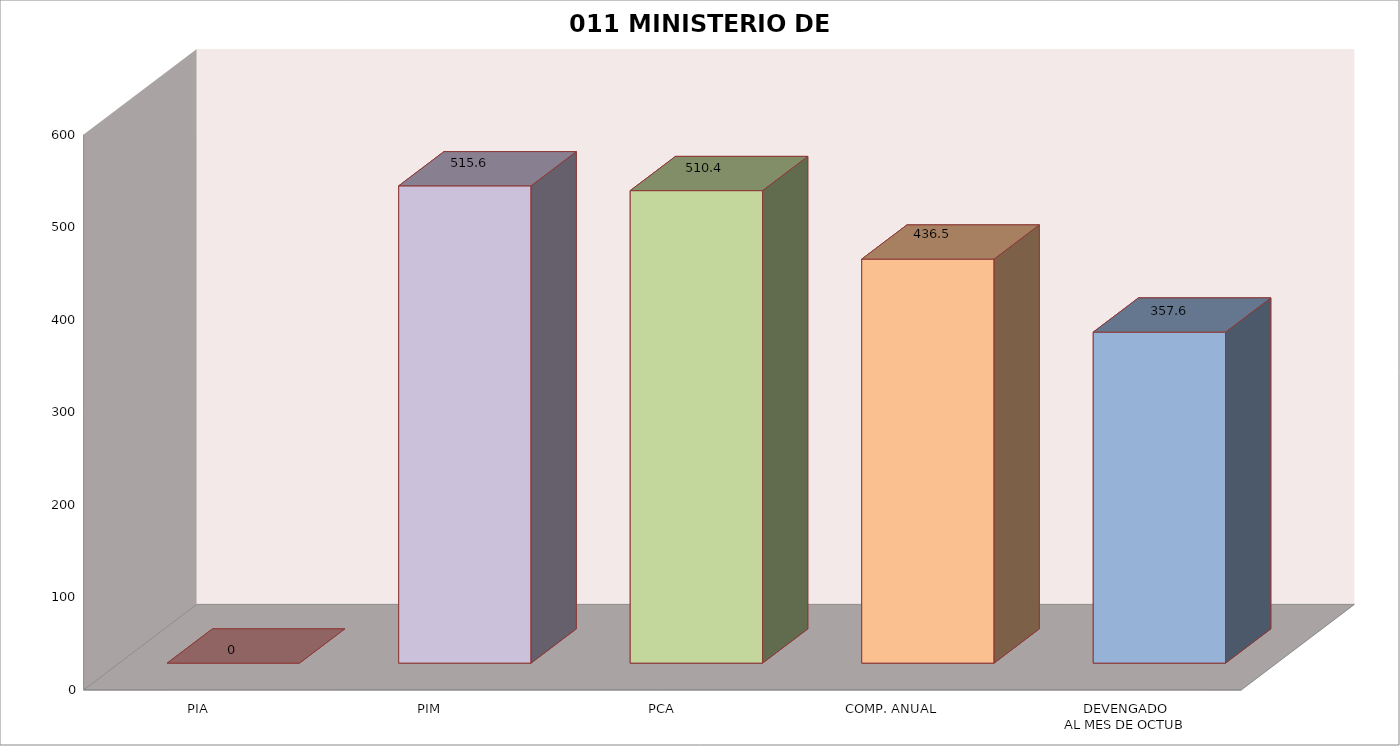
| Category | 011 MINISTERIO DE SALUD |
|---|---|
| PIA | 0 |
| PIM | 515.605 |
| PCA | 510.449 |
| COMP. ANUAL | 436.455 |
| DEVENGADO
AL MES DE OCTUB | 357.601 |